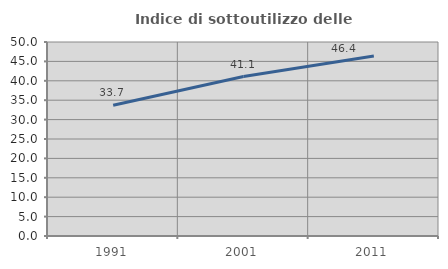
| Category | Indice di sottoutilizzo delle abitazioni  |
|---|---|
| 1991.0 | 33.684 |
| 2001.0 | 41.098 |
| 2011.0 | 46.403 |